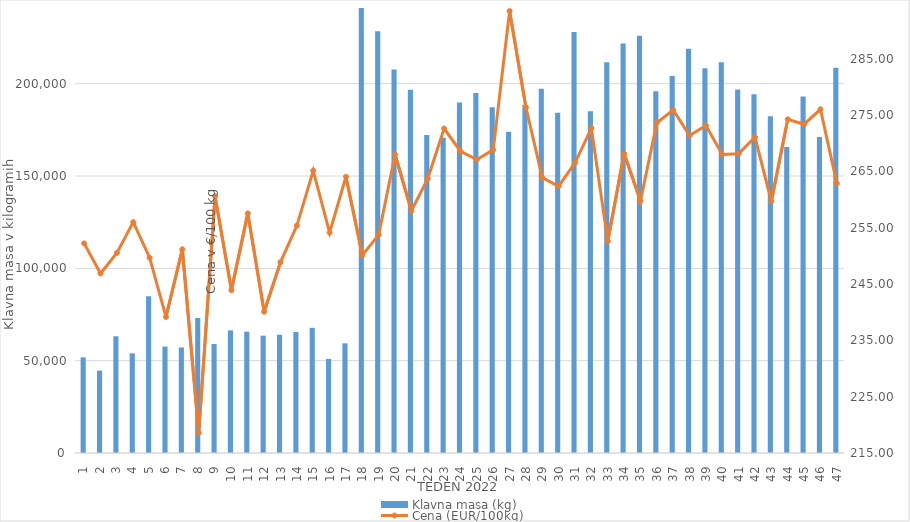
| Category | Klavna masa (kg) |
|---|---|
| 1.0 | 51818 |
| 2.0 | 44619 |
| 3.0 | 63233 |
| 4.0 | 53993 |
| 5.0 | 84871 |
| 6.0 | 57648 |
| 7.0 | 57159 |
| 8.0 | 73139 |
| 9.0 | 59056 |
| 10.0 | 66417 |
| 11.0 | 65723 |
| 12.0 | 63530 |
| 13.0 | 64069 |
| 14.0 | 65564 |
| 15.0 | 67787 |
| 16.0 | 50958 |
| 17.0 | 59387 |
| 18.0 | 241833 |
| 19.0 | 228389 |
| 20.0 | 207661 |
| 21.0 | 196732 |
| 22.0 | 172190 |
| 23.0 | 170751 |
| 24.0 | 189775 |
| 25.0 | 195029 |
| 26.0 | 187239 |
| 27.0 | 173967 |
| 28.0 | 188601 |
| 29.0 | 197293 |
| 30.0 | 184259 |
| 31.0 | 228023 |
| 32.0 | 185079 |
| 33.0 | 211612 |
| 34.0 | 221748 |
| 35.0 | 225927 |
| 36.0 | 195924 |
| 37.0 | 204224 |
| 38.0 | 218966 |
| 39.0 | 208403 |
| 40.0 | 211635 |
| 41.0 | 196841 |
| 42.0 | 194271 |
| 43.0 | 182399 |
| 44.0 | 165696 |
| 45.0 | 193022 |
| 46.0 | 171172 |
| 47.0 | 208597 |